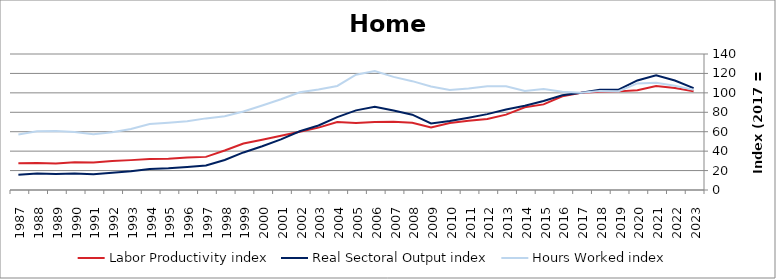
| Category | Labor Productivity index | Real Sectoral Output index | Hours Worked index |
|---|---|---|---|
| 2023.0 | 101.746 | 104.883 | 103.084 |
| 2022.0 | 105.096 | 112.705 | 107.24 |
| 2021.0 | 107.147 | 118.191 | 110.308 |
| 2020.0 | 102.734 | 112.751 | 109.75 |
| 2019.0 | 101.527 | 103.266 | 101.713 |
| 2018.0 | 101.189 | 103.134 | 101.922 |
| 2017.0 | 100 | 100 | 100 |
| 2016.0 | 96.493 | 97.557 | 101.102 |
| 2015.0 | 88.125 | 91.566 | 103.905 |
| 2014.0 | 85.09 | 86.675 | 101.862 |
| 2013.0 | 77.585 | 82.919 | 106.876 |
| 2012.0 | 73.069 | 78.083 | 106.862 |
| 2011.0 | 71.233 | 74.396 | 104.44 |
| 2010.0 | 68.909 | 70.994 | 103.026 |
| 2009.0 | 64.324 | 68.531 | 106.541 |
| 2008.0 | 69.228 | 77.567 | 112.046 |
| 2007.0 | 70.194 | 81.736 | 116.442 |
| 2006.0 | 69.937 | 85.644 | 122.458 |
| 2005.0 | 69.07 | 81.977 | 118.687 |
| 2004.0 | 70.046 | 75.039 | 107.128 |
| 2003.0 | 64.206 | 66.404 | 103.425 |
| 2002.0 | 60.022 | 60.423 | 100.669 |
| 2001.0 | 55.878 | 52.167 | 93.359 |
| 2000.0 | 51.757 | 45.035 | 87.012 |
| 1999.0 | 47.859 | 38.658 | 80.776 |
| 1998.0 | 40.629 | 30.831 | 75.885 |
| 1997.0 | 34.094 | 25.136 | 73.725 |
| 1996.0 | 33.373 | 23.647 | 70.858 |
| 1995.0 | 32.13 | 22.264 | 69.292 |
| 1994.0 | 31.834 | 21.644 | 67.99 |
| 1993.0 | 30.753 | 19.309 | 62.787 |
| 1992.0 | 29.843 | 17.747 | 59.468 |
| 1991.0 | 28.232 | 16.183 | 57.322 |
| 1990.0 | 28.634 | 17.07 | 59.613 |
| 1989.0 | 27.342 | 16.599 | 60.71 |
| 1988.0 | 27.911 | 16.894 | 60.528 |
| 1987.0 | 27.649 | 15.818 | 57.212 |